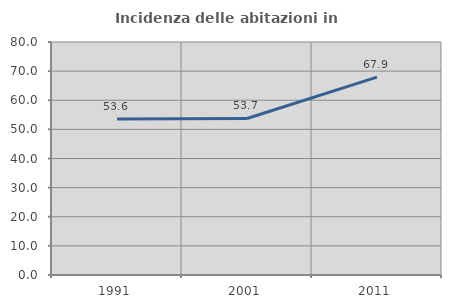
| Category | Incidenza delle abitazioni in proprietà  |
|---|---|
| 1991.0 | 53.55 |
| 2001.0 | 53.74 |
| 2011.0 | 67.949 |